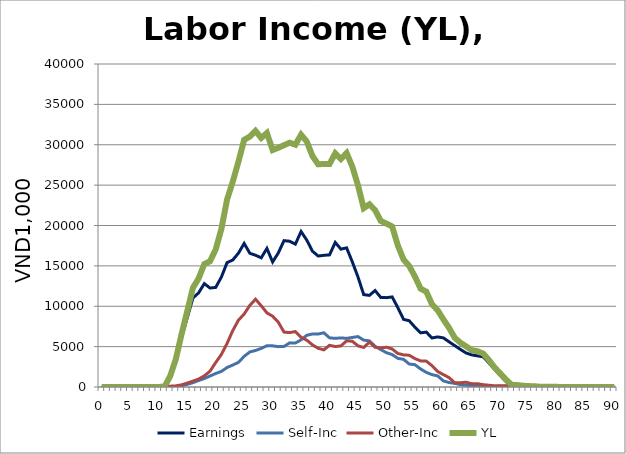
| Category | Earnings | Self-Inc | Other-Inc | YL |
|---|---|---|---|---|
| 0.0 | 0 | 0 | 0 | 0 |
| 1.0 | 0 | 0 | 0 | 0 |
| 2.0 | 0 | 0 | 0 | 0 |
| 3.0 | 0 | 0 | 0 | 0 |
| 4.0 | 0 | 0 | 0 | 0 |
| 5.0 | 0 | 0 | 0 | 0 |
| 6.0 | 0 | 0 | 0 | 0 |
| 7.0 | 0 | 0 | 0 | 0 |
| 8.0 | 0 | 0 | 0.387 | 0.387 |
| 9.0 | 0 | 0 | 6.276 | 6.276 |
| 10.0 | 0 | 0 | 11.718 | 11.718 |
| 11.0 | 0 | 11.573 | 20.755 | 32.328 |
| 12.0 | 1215.673 | 19.359 | 101.679 | 1336.711 |
| 13.0 | 3236.451 | 73.925 | 138.767 | 3449.143 |
| 14.0 | 6136.304 | 131.306 | 270.388 | 6537.999 |
| 15.0 | 8561.327 | 327.096 | 489.153 | 9377.575 |
| 16.0 | 11016.994 | 535.649 | 727.289 | 12279.932 |
| 17.0 | 11661.518 | 803.018 | 980.764 | 13445.3 |
| 18.0 | 12802.559 | 1045.651 | 1377.497 | 15225.707 |
| 19.0 | 12257.526 | 1360.02 | 1958.417 | 15575.963 |
| 20.0 | 12331.976 | 1670.58 | 3027.532 | 17030.088 |
| 21.0 | 13612.797 | 1931.448 | 4031.911 | 19576.156 |
| 22.0 | 15406.288 | 2411.749 | 5399.187 | 23217.224 |
| 23.0 | 15726.578 | 2719.645 | 6986.36 | 25432.583 |
| 24.0 | 16580.096 | 3051.589 | 8280.079 | 27911.764 |
| 25.0 | 17777.55 | 3794.835 | 9036.542 | 30608.927 |
| 26.0 | 16560.147 | 4343.27 | 10111.095 | 31014.513 |
| 27.0 | 16318.304 | 4521.535 | 10871.367 | 31711.207 |
| 28.0 | 15998.726 | 4780.338 | 10063.331 | 30842.395 |
| 29.0 | 17163.686 | 5111.186 | 9178.11 | 31452.982 |
| 30.0 | 15483.333 | 5095.35 | 8766.838 | 29345.521 |
| 31.0 | 16601.241 | 4998.53 | 8027.452 | 29627.223 |
| 32.0 | 18121.653 | 5025.701 | 6800.249 | 29947.603 |
| 33.0 | 18051.365 | 5466.868 | 6733.722 | 30251.955 |
| 34.0 | 17694.746 | 5441.44 | 6870.959 | 30007.145 |
| 35.0 | 19255.344 | 5841.236 | 6146.068 | 31242.649 |
| 36.0 | 18191.952 | 6400.634 | 5802.186 | 30394.772 |
| 37.0 | 16819.967 | 6569.407 | 5213.924 | 28603.299 |
| 38.0 | 16220.821 | 6561.787 | 4796.356 | 27578.964 |
| 39.0 | 16308.34 | 6713.176 | 4601.946 | 27623.463 |
| 40.0 | 16359.677 | 6087.932 | 5163.19 | 27610.798 |
| 41.0 | 17906.484 | 6024.216 | 5011.34 | 28942.04 |
| 42.0 | 17072.84 | 6083.218 | 5085.371 | 28241.429 |
| 43.0 | 17229.994 | 6024.264 | 5716.54 | 28970.799 |
| 44.0 | 15496.868 | 6135.611 | 5662.534 | 27295.012 |
| 45.0 | 13624.354 | 6242 | 5097.874 | 24964.228 |
| 46.0 | 11443.169 | 5805.117 | 4897.279 | 22145.565 |
| 47.0 | 11345.969 | 5716.201 | 5555.198 | 22617.368 |
| 48.0 | 11944.485 | 5041.596 | 4922.832 | 21908.912 |
| 49.0 | 11089.833 | 4637.536 | 4833.498 | 20560.867 |
| 50.0 | 11064.489 | 4244.194 | 4926.781 | 20235.464 |
| 51.0 | 11153.752 | 4010.502 | 4712.252 | 19876.506 |
| 52.0 | 9823.199 | 3547.703 | 4149.15 | 17520.052 |
| 53.0 | 8377.262 | 3429.29 | 3978.329 | 15784.881 |
| 54.0 | 8204.043 | 2843.186 | 3933.142 | 14980.37 |
| 55.0 | 7409.742 | 2759.459 | 3516.675 | 13685.876 |
| 56.0 | 6708.535 | 2233.715 | 3233.5 | 12175.749 |
| 57.0 | 6794.452 | 1811.769 | 3203.515 | 11809.736 |
| 58.0 | 6072.339 | 1527.145 | 2643.361 | 10242.844 |
| 59.0 | 6200.115 | 1377.688 | 1920.755 | 9498.558 |
| 60.0 | 6084.838 | 754.449 | 1530.584 | 8369.871 |
| 61.0 | 5595.684 | 553.816 | 1167.049 | 7316.549 |
| 62.0 | 5125.57 | 449.181 | 513.738 | 6088.488 |
| 63.0 | 4648.848 | 294.957 | 530.416 | 5474.221 |
| 64.0 | 4207.847 | 229.581 | 592.862 | 5030.291 |
| 65.0 | 3976.911 | 179.859 | 398.981 | 4555.751 |
| 66.0 | 3855.839 | 165.185 | 408.995 | 4430.019 |
| 67.0 | 3740.584 | 115.649 | 283.046 | 4139.279 |
| 68.0 | 2974.424 | 138.649 | 222.853 | 3335.926 |
| 69.0 | 2183.322 | 110.269 | 125.954 | 2419.545 |
| 70.0 | 1412.681 | 105.667 | 153.298 | 1671.646 |
| 71.0 | 680.555 | 82.097 | 161.778 | 924.43 |
| 72.0 | 0 | 80.799 | 183.298 | 264.097 |
| 73.0 | 0 | 57.075 | 176.108 | 233.183 |
| 74.0 | 0 | 45.456 | 115.204 | 160.66 |
| 75.0 | 0 | 45.445 | 63.536 | 108.981 |
| 76.0 | 0 | 65.339 | 39.402 | 104.741 |
| 77.0 | 0 | 19.862 | 4.212 | 24.074 |
| 78.0 | 0 | 19.458 | 1.287 | 20.746 |
| 79.0 | 0 | 19.751 | 1.275 | 21.027 |
| 80.0 | 0 | 17.951 | 1.312 | 19.263 |
| 81.0 | 0 | 0 | 0.726 | 0.726 |
| 82.0 | 0 | 0 | 0 | 0 |
| 83.0 | 0 | 0 | 0 | 0 |
| 84.0 | 0 | 0 | 0 | 0 |
| 85.0 | 0 | 0 | 0 | 0 |
| 86.0 | 0 | 0 | 0 | 0 |
| 87.0 | 0 | 0 | 0 | 0 |
| 88.0 | 0 | 0 | 0 | 0 |
| 89.0 | 0 | 0 | 0 | 0 |
| 90.0 | 0 | 0 | 0 | 0 |